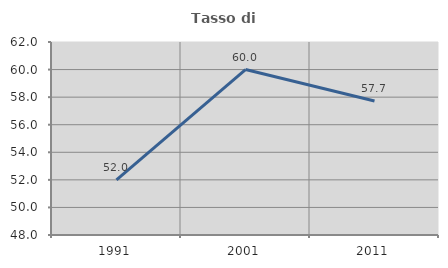
| Category | Tasso di occupazione   |
|---|---|
| 1991.0 | 52 |
| 2001.0 | 60 |
| 2011.0 | 57.716 |